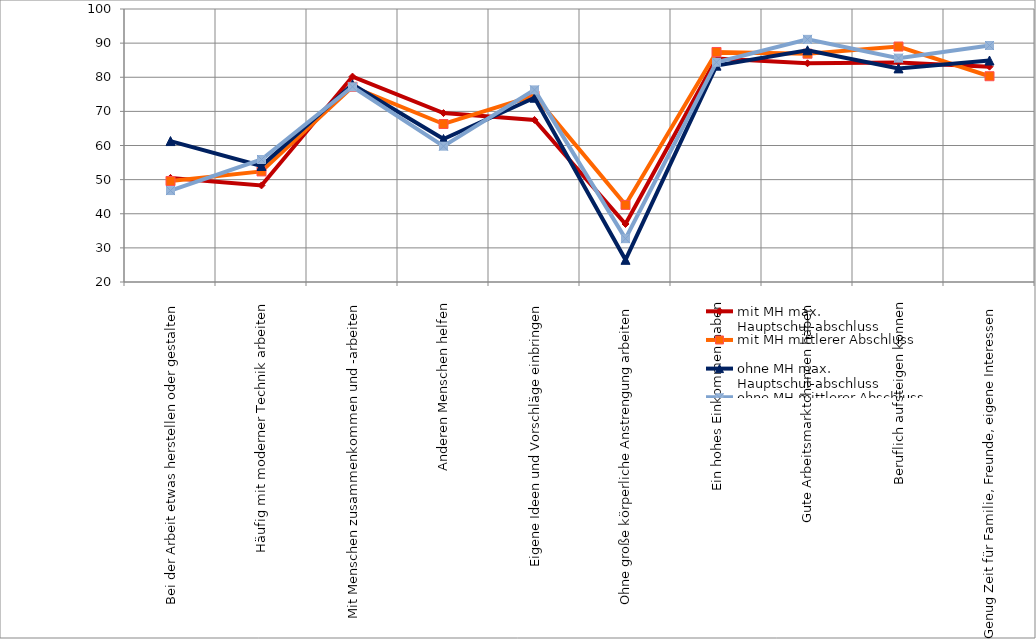
| Category | mit MH max. Hauptschul-abschluss | mit MH mittlerer Abschluss | ohne MH max. Hauptschul-abschluss | ohne MH mittlerer Abschluss |
|---|---|---|---|---|
| Bei der Arbeit etwas herstellen oder gestalten | 50.5 | 49.6 | 61.3 | 46.8 |
| Häufig mit moderner Technik arbeiten | 48.3 | 52.4 | 54 | 55.9 |
| Mit Menschen zusammenkommen und -arbeiten | 80.2 | 77.2 | 77.9 | 77.2 |
| Anderen Menschen helfen | 69.5 | 66.3 | 61.9 | 59.8 |
| Eigene Ideen und Vorschläge einbringen | 67.5 | 74.6 | 74 | 76.3 |
| Ohne große körperliche Anstrengung arbeiten | 37 | 42.6 | 26.5 | 32.7 |
| Ein hohes Einkommen haben | 85.5 | 87.4 | 83.4 | 84.4 |
| Gute Arbeitsmarktchancen haben | 84.1 | 86.9 | 87.9 | 91.1 |
| Beruflich aufsteigen können | 84.3 | 89 | 82.6 | 85.6 |
| Genug Zeit für Familie, Freunde, eigene Interessen | 83.1 | 80.3 | 84.9 | 89.3 |